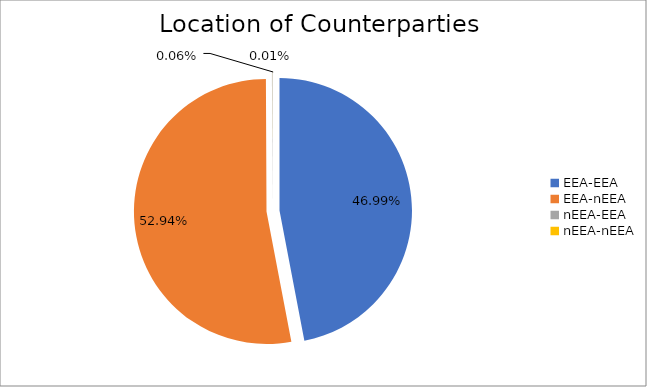
| Category | Series 0 |
|---|---|
| EEA-EEA | 5903307.163 |
| EEA-nEEA | 6649882.205 |
| nEEA-EEA | 8165.31 |
| nEEA-nEEA | 800.269 |